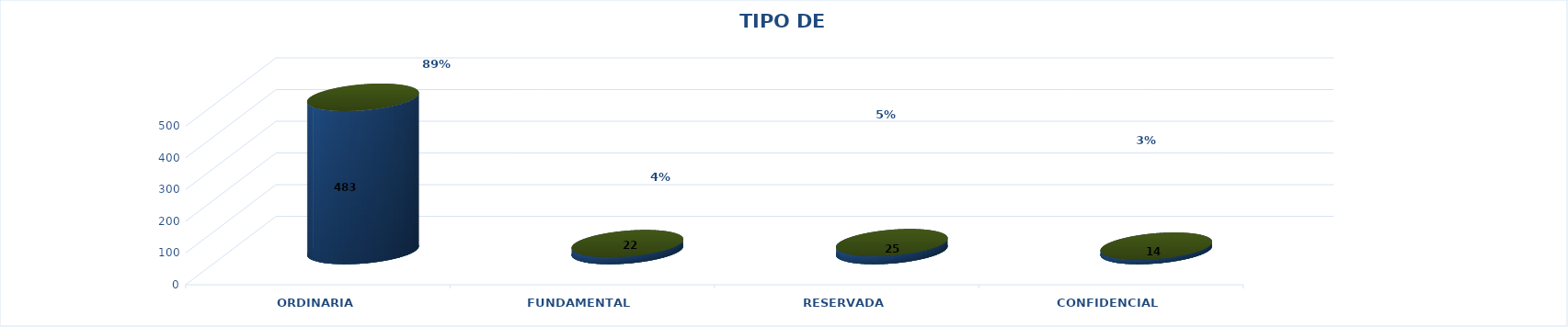
| Category | Series 0 | Series 2 | Series 1 | Series 3 | Series 4 |
|---|---|---|---|---|---|
| ORDINARIA |  |  |  | 483 | 0.888 |
| FUNDAMENTAL |  |  |  | 22 | 0.04 |
| RESERVADA |  |  |  | 25 | 0.046 |
| CONFIDENCIAL |  |  |  | 14 | 0.026 |